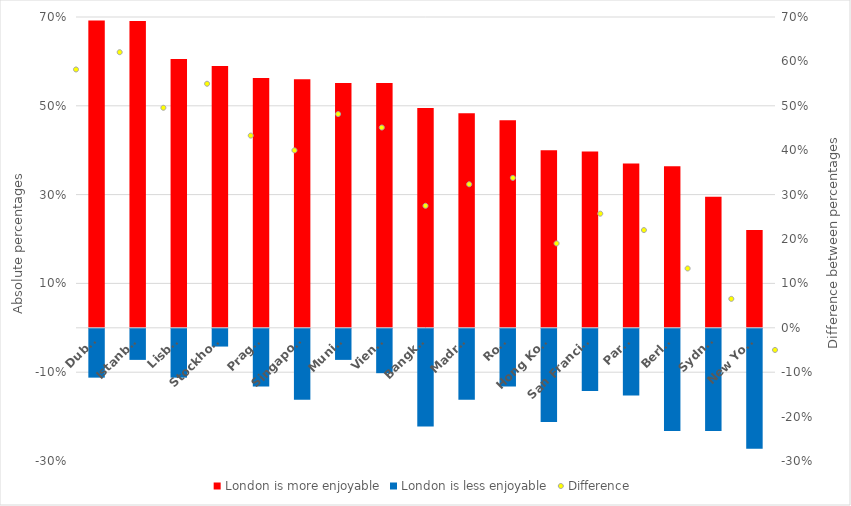
| Category | London is more enjoyable | London is less enjoyable |
|---|---|---|
| Dubai | 0.692 | -0.11 |
| Istanbul | 0.691 | -0.07 |
| Lisbon | 0.606 | -0.11 |
| Stockholm | 0.59 | -0.04 |
| Prague | 0.563 | -0.13 |
| Singapore | 0.56 | -0.16 |
| Munich | 0.551 | -0.07 |
| Vienna | 0.551 | -0.1 |
| Bangkok | 0.495 | -0.22 |
| Madrid | 0.483 | -0.16 |
| Rome | 0.468 | -0.13 |
| Hong Kong | 0.4 | -0.21 |
| San Francisco | 0.397 | -0.14 |
| Paris | 0.37 | -0.15 |
| Berlin | 0.364 | -0.23 |
| Sydney | 0.295 | -0.23 |
| New York | 0.22 | -0.27 |